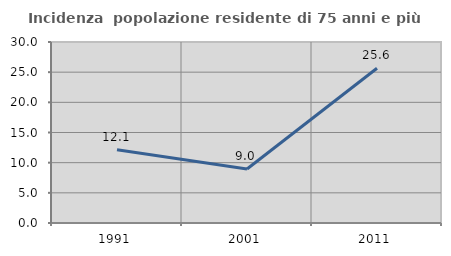
| Category | Incidenza  popolazione residente di 75 anni e più |
|---|---|
| 1991.0 | 12.143 |
| 2001.0 | 8.955 |
| 2011.0 | 25.641 |